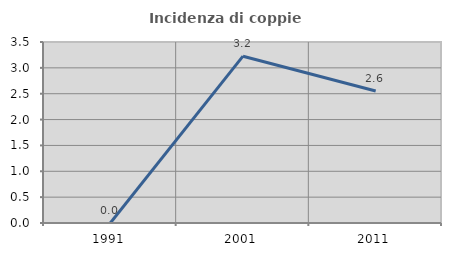
| Category | Incidenza di coppie miste |
|---|---|
| 1991.0 | 0 |
| 2001.0 | 3.226 |
| 2011.0 | 2.553 |